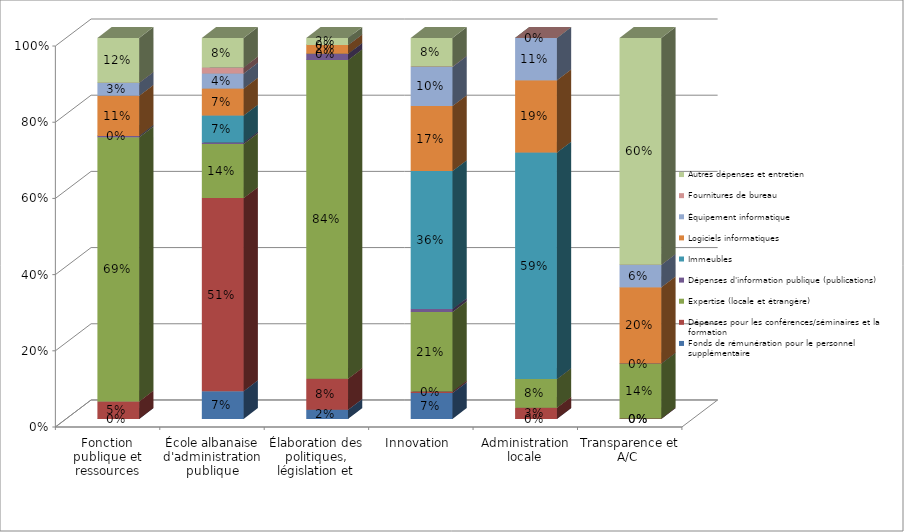
| Category | Fonds de rémunération pour le personnel supplémentaire   | Dépenses pour les conférences/séminaires et la formation    | Expertise (locale et étrangère) | Dépenses d'information publique (publications)    | Immeubles | Logiciels informatiques | Équipement informatique | Fournitures de bureau | Autres dépenses et entretien |
|---|---|---|---|---|---|---|---|---|---|
| Fonction publique et ressources humaines  | 0 | 0.046 | 0.693 | 0.003 | 0 | 0.105 | 0.034 | 0 | 0.118 |
| École albanaise d'administration publique | 0.073 | 0.507 | 0.142 | 0.004 | 0.071 | 0.071 | 0.039 | 0.016 | 0.077 |
| Élaboration des politiques, législation et suivi | 0.024 | 0.081 | 0.836 | 0.017 | 0 | 0.023 | 0 | 0 | 0.019 |
| Innovation  | 0.068 | 0.004 | 0.209 | 0.008 | 0.362 | 0.171 | 0.102 | 0.001 | 0.075 |
| Administration locale | 0 | 0.029 | 0.075 | 0 | 0.594 | 0.19 | 0.111 | 0 | 0 |
| Transparence et A/C  | 0 | 0.001 | 0.144 | 0 | 0 | 0.2 | 0.059 | 0 | 0.595 |